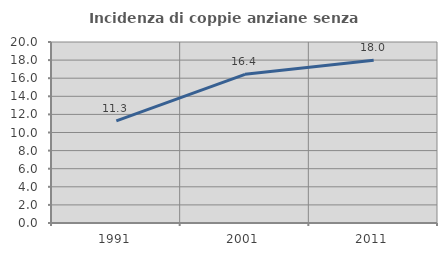
| Category | Incidenza di coppie anziane senza figli  |
|---|---|
| 1991.0 | 11.278 |
| 2001.0 | 16.428 |
| 2011.0 | 17.994 |